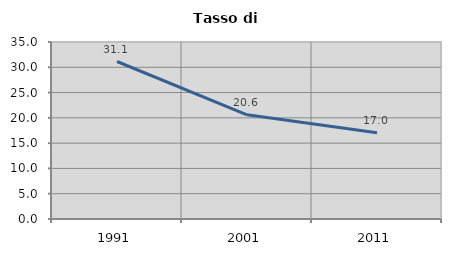
| Category | Tasso di disoccupazione   |
|---|---|
| 1991.0 | 31.143 |
| 2001.0 | 20.597 |
| 2011.0 | 17.047 |